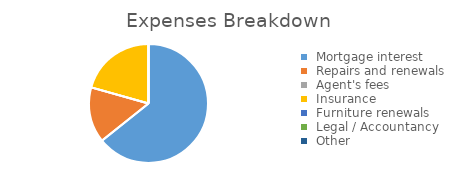
| Category | Series 0 |
|---|---|
| Mortgage interest | 325 |
| Repairs and renewals | 76.25 |
| Agent's fees | 0 |
| Insurance | 104.32 |
| Furniture renewals | 0 |
| Legal / Accountancy | 0 |
| Other | 0 |